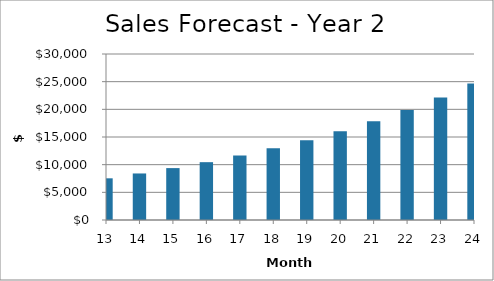
| Category | Year 2 |
|---|---|
| 13.0 | 7533.42 |
| 14.0 | 8410.728 |
| 15.0 | 9379.289 |
| 16.0 | 10450.861 |
| 17.0 | 11638.486 |
| 18.0 | 12956.659 |
| 19.0 | 14421.504 |
| 20.0 | 16050.983 |
| 21.0 | 17865.113 |
| 22.0 | 19886.23 |
| 23.0 | 22139.261 |
| 24.0 | 24652.045 |